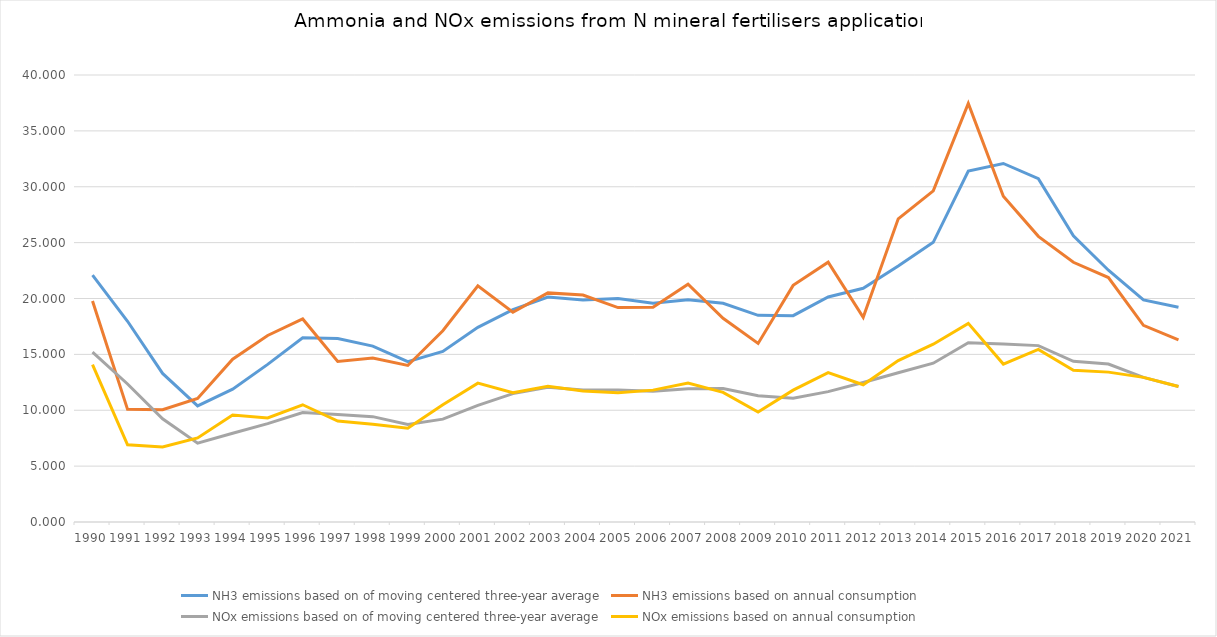
| Category | NH3 emissions based on of moving centered three-year average | NH3 emissions based on annual consumption | NOx emissions based on of moving centered three-year average | NOx emissions based on annual consumption |
|---|---|---|---|---|
| 1990.0 | 22.09 | 19.769 | 15.194 | 14.09 |
| 1991.0 | 17.963 | 10.078 | 12.35 | 6.907 |
| 1992.0 | 13.296 | 10.04 | 9.239 | 6.72 |
| 1993.0 | 10.391 | 11.055 | 7.051 | 7.526 |
| 1994.0 | 11.888 | 14.57 | 7.941 | 9.576 |
| 1995.0 | 14.106 | 16.694 | 8.803 | 9.308 |
| 1996.0 | 16.479 | 18.172 | 9.792 | 10.492 |
| 1997.0 | 16.411 | 14.367 | 9.612 | 9.036 |
| 1998.0 | 15.736 | 14.67 | 9.427 | 8.752 |
| 1999.0 | 14.349 | 14.009 | 8.724 | 8.384 |
| 2000.0 | 15.264 | 17.112 | 9.207 | 10.484 |
| 2001.0 | 17.419 | 21.136 | 10.431 | 12.424 |
| 2002.0 | 19.004 | 18.764 | 11.491 | 11.564 |
| 2003.0 | 20.134 | 20.503 | 12.047 | 12.152 |
| 2004.0 | 19.859 | 20.31 | 11.811 | 11.716 |
| 2005.0 | 20.001 | 19.191 | 11.809 | 11.56 |
| 2006.0 | 19.573 | 19.219 | 11.692 | 11.8 |
| 2007.0 | 19.894 | 21.273 | 11.932 | 12.436 |
| 2008.0 | 19.573 | 18.228 | 11.945 | 11.6 |
| 2009.0 | 18.494 | 15.98 | 11.292 | 9.84 |
| 2010.0 | 18.461 | 21.176 | 11.08 | 11.8 |
| 2011.0 | 20.136 | 23.251 | 11.667 | 13.36 |
| 2012.0 | 20.914 | 18.315 | 12.48 | 12.28 |
| 2013.0 | 22.899 | 27.132 | 13.36 | 14.44 |
| 2014.0 | 25.028 | 29.637 | 14.209 | 15.908 |
| 2015.0 | 31.409 | 37.457 | 16.041 | 17.776 |
| 2016.0 | 32.082 | 29.152 | 15.939 | 14.132 |
| 2017.0 | 30.724 | 25.562 | 15.784 | 15.444 |
| 2018.0 | 25.618 | 23.24 | 14.384 | 13.572 |
| 2019.0 | 22.528 | 21.879 | 14.137 | 13.412 |
| 2020.0 | 19.873 | 17.598 | 12.941 | 12.941 |
| 2021.0 | 19.218 | 16.305 | 12.119 | 12.119 |